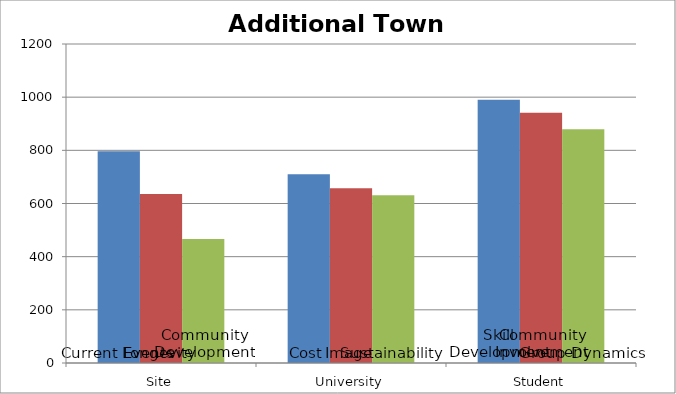
| Category | Alignment1 | Alignment2 | Alignment3 |
|---|---|---|---|
| 0 | 796.875 | 636 | 466 |
| 1 | 710 | 657.75 | 630.625 |
| 2 | 990 | 941.25 | 879 |